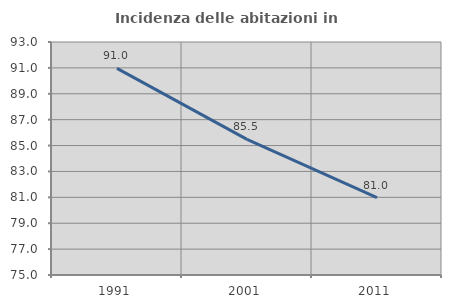
| Category | Incidenza delle abitazioni in proprietà  |
|---|---|
| 1991.0 | 90.957 |
| 2001.0 | 85.475 |
| 2011.0 | 80.982 |